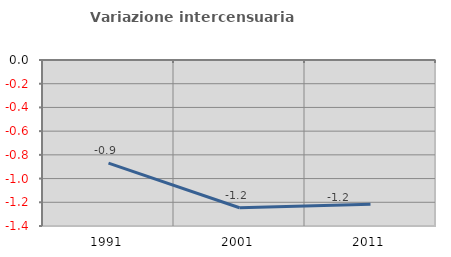
| Category | Variazione intercensuaria annua |
|---|---|
| 1991.0 | -0.869 |
| 2001.0 | -1.246 |
| 2011.0 | -1.217 |